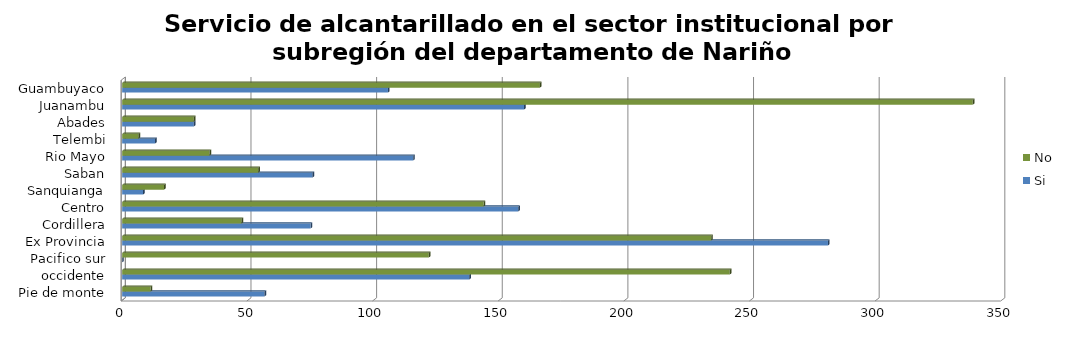
| Category | Si | No |
|---|---|---|
| Pie de monte | 56.65 | 11.33 |
| occidente | 138.16 | 241.78 |
| Pacifico sur | 0 | 122 |
| Ex Provincia | 280.871 | 234.389 |
| Cordillera | 75 | 47.5 |
| Centro | 157.62 | 143.85 |
| Sanquianga | 8.33 | 16.66 |
| Saban | 75.78 | 54.18 |
| Rio Mayo | 115.8 | 34.74 |
| Telembi | 13.06 | 6.53 |
| Abades | 28.49 | 28.49 |
| Juanambu | 159.93 | 338.49 |
| Guambuyaco | 105.77 | 166.21 |